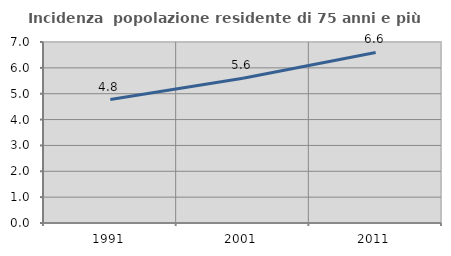
| Category | Incidenza  popolazione residente di 75 anni e più |
|---|---|
| 1991.0 | 4.775 |
| 2001.0 | 5.599 |
| 2011.0 | 6.596 |